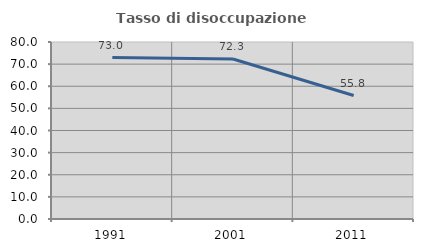
| Category | Tasso di disoccupazione giovanile  |
|---|---|
| 1991.0 | 72.958 |
| 2001.0 | 72.296 |
| 2011.0 | 55.802 |